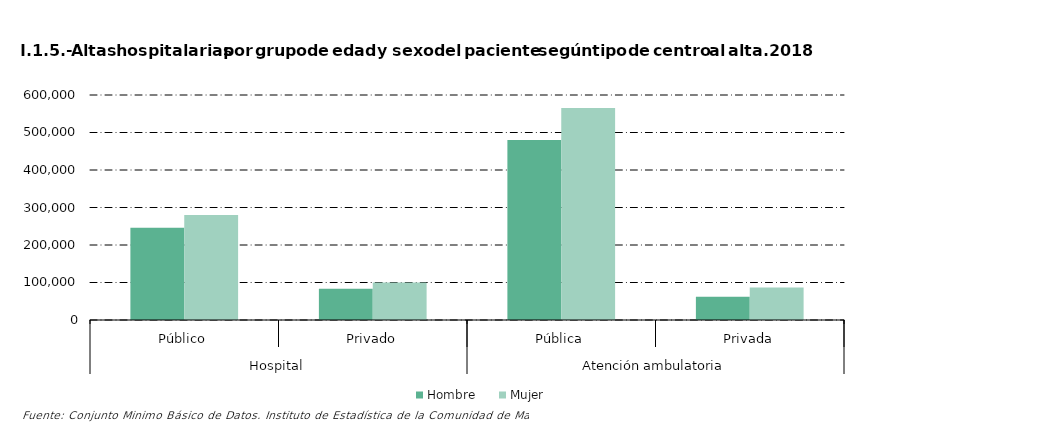
| Category |     Hombre |     Mujer |
|---|---|---|
| 0 | 245732 | 279813 |
| 1 | 83555 | 100132 |
| 2 | 480046 | 565084 |
| 3 | 61855 | 86554 |